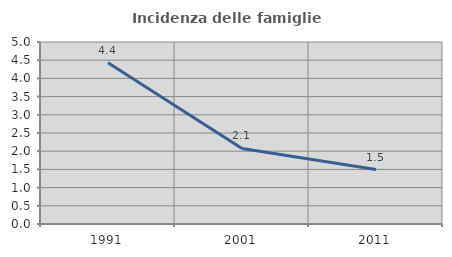
| Category | Incidenza delle famiglie numerose |
|---|---|
| 1991.0 | 4.43 |
| 2001.0 | 2.076 |
| 2011.0 | 1.494 |